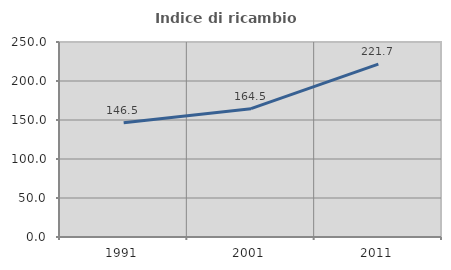
| Category | Indice di ricambio occupazionale  |
|---|---|
| 1991.0 | 146.498 |
| 2001.0 | 164.488 |
| 2011.0 | 221.677 |